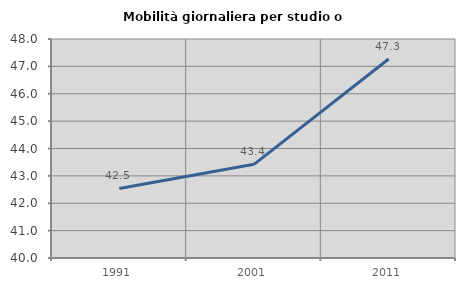
| Category | Mobilità giornaliera per studio o lavoro |
|---|---|
| 1991.0 | 42.54 |
| 2001.0 | 43.421 |
| 2011.0 | 47.271 |